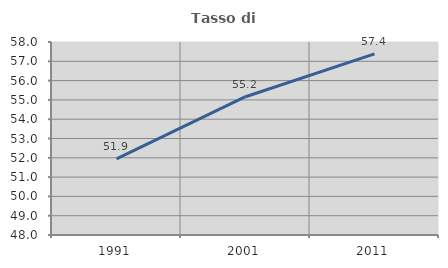
| Category | Tasso di occupazione   |
|---|---|
| 1991.0 | 51.947 |
| 2001.0 | 55.165 |
| 2011.0 | 57.385 |